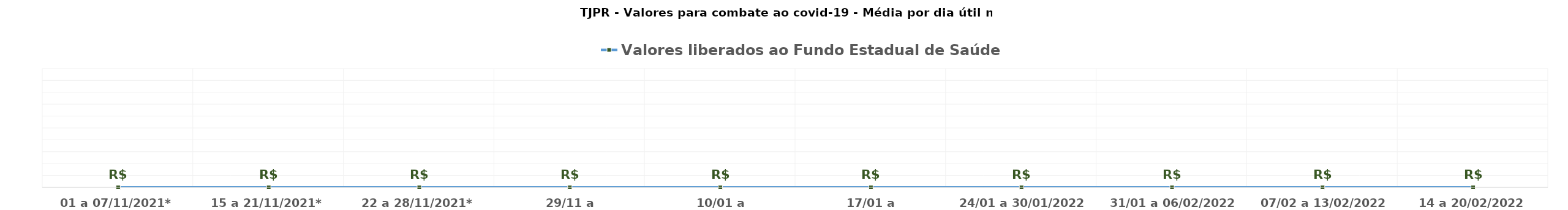
| Category | Valores liberados ao Fundo Estadual de Saúde |
|---|---|
| 01 a 07/11/2021* | 0 |
| 15 a 21/11/2021* | 0 |
| 22 a 28/11/2021* | 0 |
| 29/11 a 05/12/2021* | 0 |
| 10/01 a 16/01/2022* | 0 |
| 17/01 a 23/01/2022* | 0 |
| 24/01 a 30/01/2022 | 0 |
| 31/01 a 06/02/2022 | 0 |
| 07/02 a 13/02/2022 | 0 |
| 14 a 20/02/2022 | 0 |